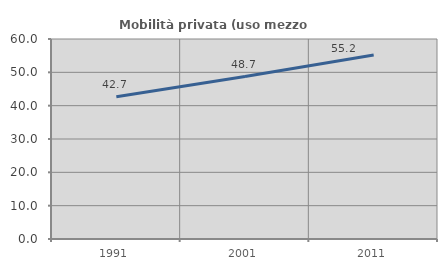
| Category | Mobilità privata (uso mezzo privato) |
|---|---|
| 1991.0 | 42.707 |
| 2001.0 | 48.728 |
| 2011.0 | 55.187 |